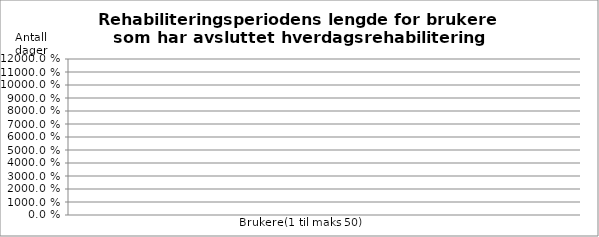
| Category | Series 1 | Prosent |
|---|---|---|
| Hjemmetjenester | 0 | 0 |
| Sykehusopphold | 0 | 0 |
| Korttids-/rehab.opphold | 0 | 0 |
| KAD/øyeblikkelig hjelp | 0 | 0 |